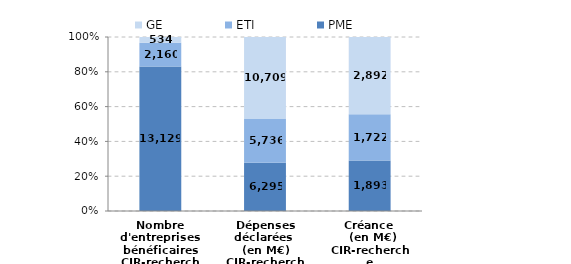
| Category | PME | ETI | GE |
|---|---|---|---|
| Nombre d'entreprises bénéficaires
CIR-recherche | 13129 | 2160 | 534 |
| Dépenses déclarées 
(en M€)
CIR-recherche | 6295.46 | 5736.21 | 10709.33 |
| Créance 
 (en M€)
CIR-recherche | 1892.87 | 1722.03 | 2891.97 |